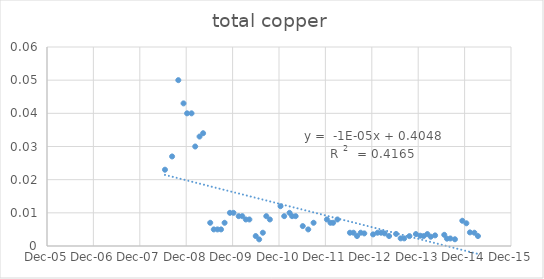
| Category | Series 0 |
|---|---|
| 39618.0 | 0.023 |
| 39674.0 | 0.027 |
| 39723.0 | 0.05 |
| 39764.0 | 0.043 |
| 39792.0 | 0.04 |
| 39827.0 | 0.04 |
| 39856.0 | 0.03 |
| 39890.0 | 0.033 |
| 39918.0 | 0.034 |
| 39974.0 | 0.007 |
| 40002.0 | 0.005 |
| 40031.0 | 0.005 |
| 40059.0 | 0.005 |
| 40087.0 | 0.007 |
| 40129.0 | 0.01 |
| 40157.0 | 0.01 |
| 40198.0 | 0.009 |
| 40226.0 | 0.009 |
| 40282.0 | 0.008 |
| 40254.0 | 0.008 |
| 40332.0 | 0.003 |
| 40359.0 | 0.002 |
| 40388.0 | 0.004 |
| 40415.0 | 0.009 |
| 40443.0 | 0.008 |
| 40527.0 | 0.012 |
| 40556.0 | 0.009 |
| 40598.0 | 0.01 |
| 40618.0 | 0.009 |
| 40646.0 | 0.009 |
| 40702.0 | 0.006 |
| 40745.0 | 0.005 |
| 40787.0 | 0.007 |
| 40892.0 | 0.008 |
| 40920.0 | 0.007 |
| 40941.0 | 0.007 |
| 40975.0 | 0.008 |
| 41073.0 | 0.004 |
| 41101.0 | 0.004 |
| 41129.0 | 0.003 |
| 41158.0 | 0.004 |
| 41186.0 | 0.004 |
| 41255.0 | 0.004 |
| 41290.0 | 0.004 |
| 41318.0 | 0.004 |
| 41346.0 | 0.004 |
| 41381.0 | 0.003 |
| 41436.0 | 0.004 |
| 41472.0 | 0.002 |
| 41500.0 | 0.002 |
| 41541.0 | 0.003 |
| 41592.0 | 0.004 |
| 41626.0 | 0.003 |
| 41653.0 | 0.003 |
| 41682.0 | 0.004 |
| 41709.0 | 0.003 |
| 41743.0 | 0.003 |
| 41815.0 | 0.003 |
| 41836.0 | 0.002 |
| 41863.0 | 0.002 |
| 41899.0 | 0.002 |
| 41957.0 | 0.008 |
| 41989.0 | 0.007 |
| 42017.0 | 0.004 |
| 42052.0 | 0.004 |
| 42080.0 | 0.003 |